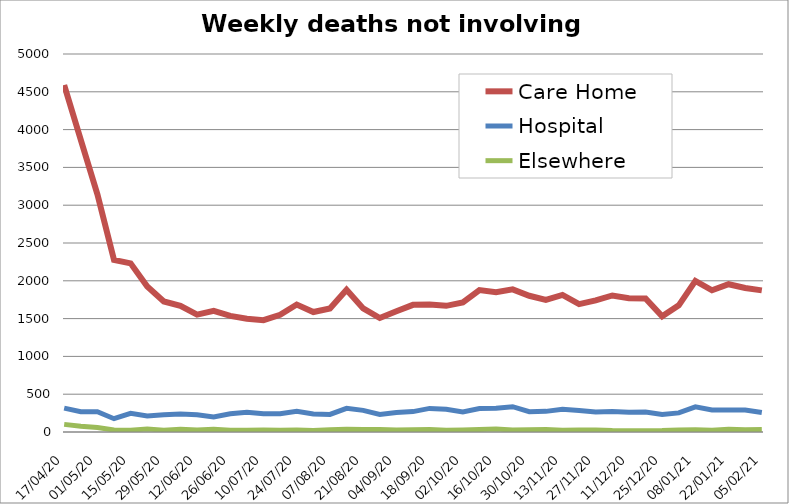
| Category | Care Home | Hospital | Elsewhere |
|---|---|---|---|
| 2020-04-17 | 4590 | 316 | 101 |
| 2020-04-24 | 3865 | 268 | 76 |
| 2020-05-01 | 3144 | 269 | 59 |
| 2020-05-08 | 2275 | 176 | 26 |
| 2020-05-15 | 2231 | 248 | 24 |
| 2020-05-22 | 1926 | 213 | 41 |
| 2020-05-29 | 1726 | 229 | 24 |
| 2020-06-05 | 1668 | 239 | 36 |
| 2020-06-12 | 1552 | 227 | 26 |
| 2020-06-19 | 1603 | 200 | 36 |
| 2020-06-26 | 1536 | 241 | 24 |
| 2020-07-03 | 1499 | 262 | 23 |
| 2020-07-10 | 1479 | 240 | 28 |
| 2020-07-17 | 1551 | 241 | 23 |
| 2020-07-24 | 1686 | 275 | 25 |
| 2020-07-31 | 1587 | 239 | 21 |
| 2020-08-07 | 1633 | 232 | 31 |
| 2020-08-14 | 1881 | 313 | 38 |
| 2020-08-21 | 1635 | 286 | 33 |
| 2020-08-28 | 1508 | 232 | 34 |
| 2020-09-04 | 1597 | 258 | 26 |
| 2020-09-11 | 1682 | 270 | 30 |
| 2020-09-18 | 1687 | 312 | 34 |
| 2020-09-25 | 1669 | 301 | 23 |
| 2020-10-02 | 1713 | 264 | 27 |
| 2020-10-09 | 1877 | 311 | 33 |
| 2020-10-16 | 1849 | 315 | 40 |
| 2020-10-23 | 1887 | 335 | 26 |
| 2020-10-30 | 1802 | 269 | 30 |
| 2020-11-06 | 1748 | 273 | 32 |
| 2020-11-13 | 1813 | 302 | 24 |
| 2020-11-20 | 1692 | 285 | 26 |
| 2020-11-27 | 1740 | 265 | 25 |
| 2020-12-04 | 1806 | 271 | 19 |
| 2020-12-11 | 1770 | 261 | 18 |
| 2020-12-18 | 1766 | 263 | 17 |
| 2020-12-25 | 1530 | 231 | 19 |
| 2021-01-01 | 1675 | 253 | 26 |
| 2021-01-08 | 1999 | 333 | 30 |
| 2021-01-15 | 1874 | 291 | 22 |
| 2021-01-22 | 1955 | 292 | 36 |
| 2021-01-29 | 1905 | 291 | 29 |
| 2021-02-05 | 1873 | 258 | 32 |